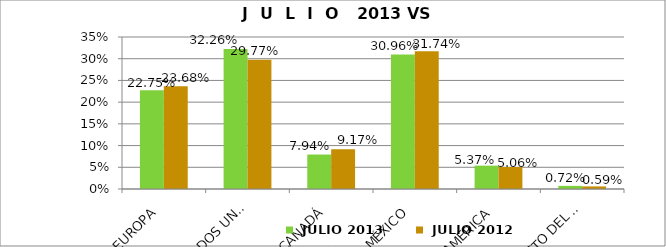
| Category |  JULIO 2013 |  JULIO 2012 |
|---|---|---|
| EUROPA | 0.227 | 0.237 |
| ESTADOS UNIDOS | 0.323 | 0.298 |
| CANADÁ | 0.079 | 0.092 |
| MÉXICO | 0.31 | 0.317 |
| SUDAMERICA | 0.054 | 0.051 |
| RESTO DEL MUNDO | 0.007 | 0.006 |